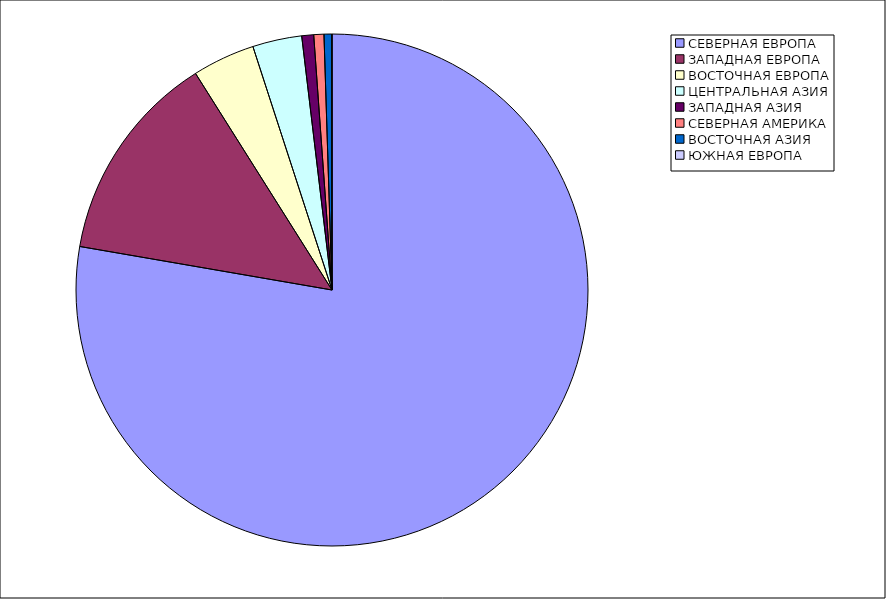
| Category | Оборот |
|---|---|
| СЕВЕРНАЯ ЕВРОПА | 77.72 |
| ЗАПАДНАЯ ЕВРОПА | 13.33 |
| ВОСТОЧНАЯ ЕВРОПА | 3.95 |
| ЦЕНТРАЛЬНАЯ АЗИЯ | 3.11 |
| ЗАПАДНАЯ АЗИЯ | 0.75 |
| СЕВЕРНАЯ АМЕРИКА | 0.64 |
| ВОСТОЧНАЯ АЗИЯ | 0.49 |
| ЮЖНАЯ ЕВРОПА | 0.01 |